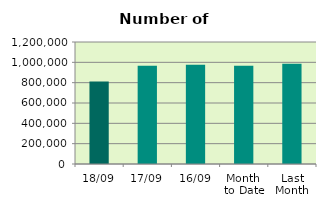
| Category | Series 0 |
|---|---|
| 18/09 | 811828 |
| 17/09 | 966076 |
| 16/09 | 976984 |
| Month 
to Date | 966854 |
| Last
Month | 986270.455 |